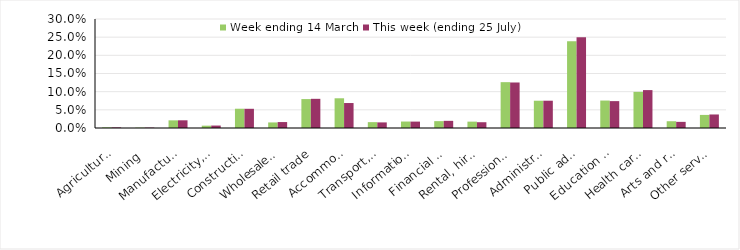
| Category | Week ending 14 March | This week (ending 25 July) |
|---|---|---|
| Agriculture, forestry and fishing | 0.002 | 0.002 |
| Mining | 0.001 | 0.001 |
| Manufacturing | 0.021 | 0.021 |
| Electricity, gas, water and waste services | 0.006 | 0.007 |
| Construction | 0.053 | 0.053 |
| Wholesale trade | 0.015 | 0.016 |
| Retail trade | 0.08 | 0.08 |
| Accommodation and food services | 0.082 | 0.069 |
| Transport, postal and warehousing | 0.016 | 0.015 |
| Information media and telecommunications | 0.018 | 0.018 |
| Financial and insurance services | 0.019 | 0.02 |
| Rental, hiring and real estate services | 0.017 | 0.016 |
| Professional, scientific and technical services | 0.126 | 0.125 |
| Administrative and support services | 0.075 | 0.075 |
| Public administration and safety | 0.239 | 0.25 |
| Education and training | 0.076 | 0.074 |
| Health care and social assistance | 0.099 | 0.104 |
| Arts and recreation services | 0.019 | 0.017 |
| Other services | 0.036 | 0.037 |